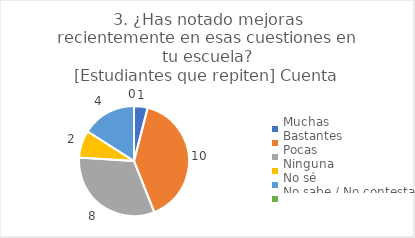
| Category | 3. ¿Has notado mejoras recientemente en esas cuestiones en tu escuela?
[Estudiantes que repiten] |
|---|---|
| Muchas  | 0.04 |
| Bastantes  | 0.4 |
| Pocas  | 0.32 |
| Ninguna  | 0.08 |
| No sé  | 0.16 |
| No sabe / No contesta | 0 |